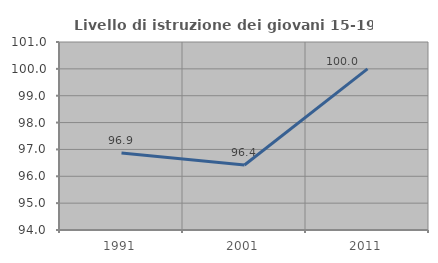
| Category | Livello di istruzione dei giovani 15-19 anni |
|---|---|
| 1991.0 | 96.868 |
| 2001.0 | 96.419 |
| 2011.0 | 100 |